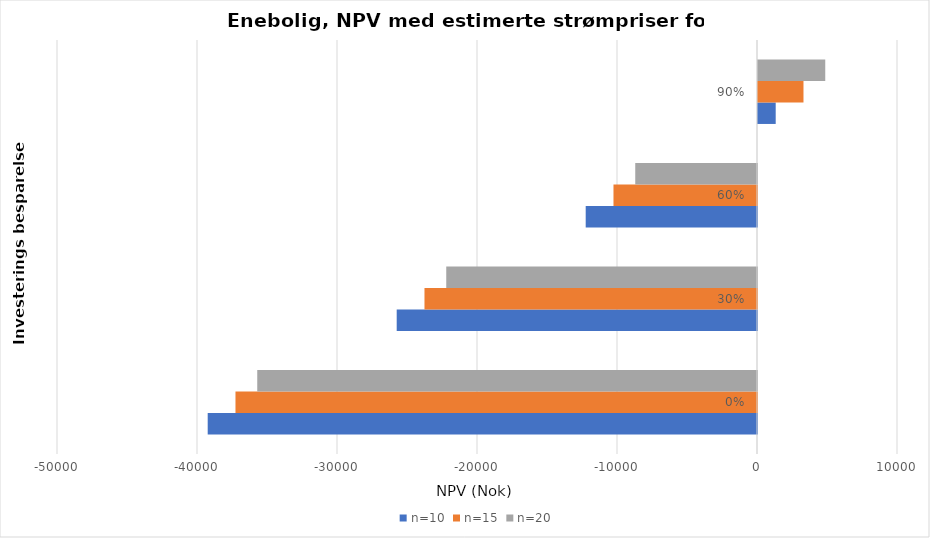
| Category | n=10 | n=15 | n=20 |
|---|---|---|---|
| 0.0 | -39235.514 | -37251.302 | -35696.62 |
| 0.3 | -25735.514 | -23751.302 | -22196.62 |
| 0.6 | -12235.514 | -10251.302 | -8696.62 |
| 0.9 | 1264.486 | 3248.698 | 4803.38 |